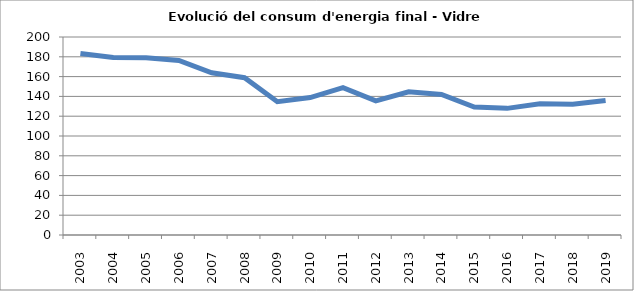
| Category | 183,3 |
|---|---|
| 2003.0 | 183.3 |
| 2004.0 | 179.3 |
| 2005.0 | 179.01 |
| 2006.0 | 176.31 |
| 2007.0 | 163.91 |
| 2008.0 | 158.85 |
| 2009.0 | 134.68 |
| 2010.0 | 138.79 |
| 2011.0 | 148.82 |
| 2012.0 | 135.56 |
| 2013.0 | 144.72 |
| 2014.0 | 142.01 |
| 2015.0 | 129.2 |
| 2016.0 | 127.92 |
| 2017.0 | 132.61 |
| 2018.0 | 132.02 |
| 2019.0 | 135.9 |